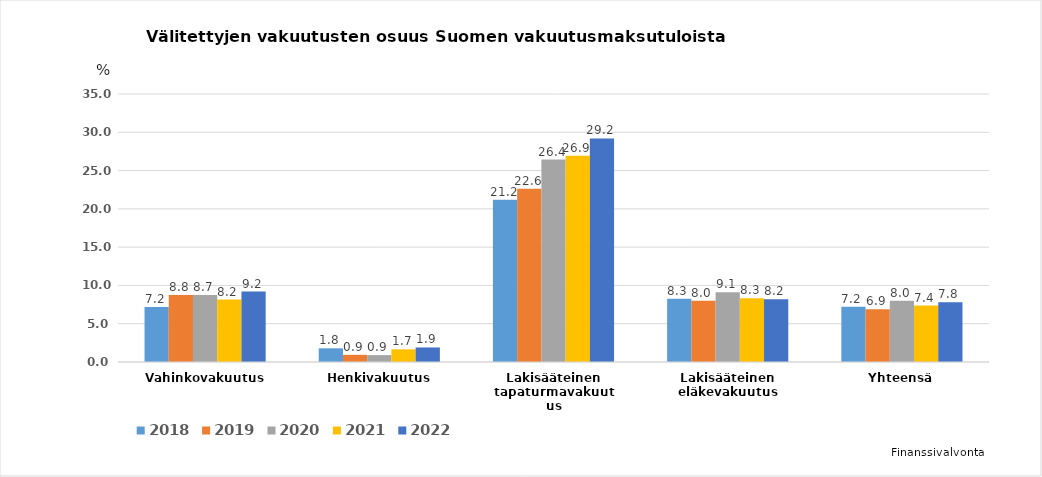
| Category | 2018 | 2019 | 2020 | 2021 | 2022 |
|---|---|---|---|---|---|
| Vahinkovakuutus | 7.184 | 8.751 | 8.75 | 8.151 | 9.193 |
| Henkivakuutus | 1.786 | 0.938 | 0.899 | 1.654 | 1.898 |
| Lakisääteinen tapaturmavakuutus | 21.186 | 22.632 | 26.436 | 26.92 | 29.202 |
| Lakisääteinen eläkevakuutus | 8.268 | 8.015 | 9.101 | 8.331 | 8.197 |
| Yhteensä | 7.208 | 6.878 | 8 | 7.377 | 7.794 |